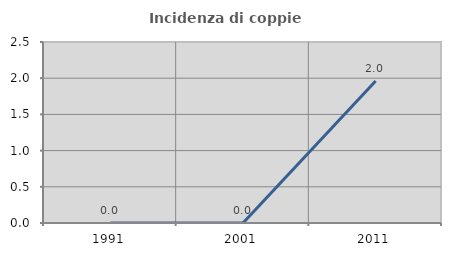
| Category | Incidenza di coppie miste |
|---|---|
| 1991.0 | 0 |
| 2001.0 | 0 |
| 2011.0 | 1.961 |